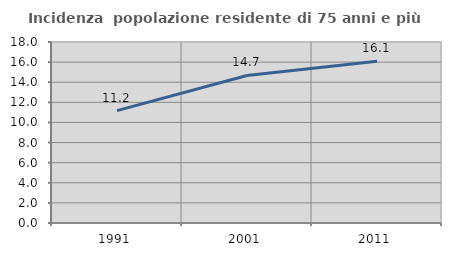
| Category | Incidenza  popolazione residente di 75 anni e più |
|---|---|
| 1991.0 | 11.175 |
| 2001.0 | 14.67 |
| 2011.0 | 16.085 |